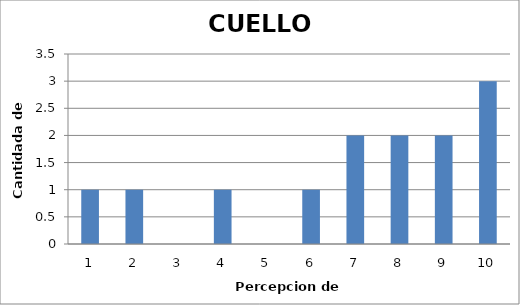
| Category | Series 0 |
|---|---|
| 0 | 1 |
| 1 | 1 |
| 2 | 0 |
| 3 | 1 |
| 4 | 0 |
| 5 | 1 |
| 6 | 2 |
| 7 | 2 |
| 8 | 2 |
| 9 | 3 |